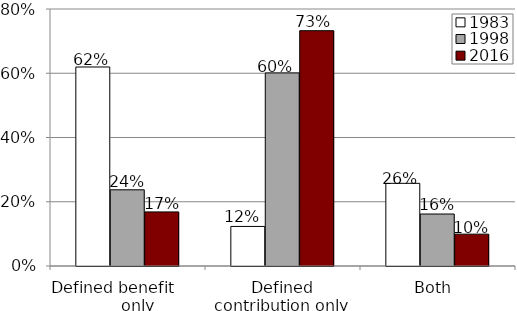
| Category | 1983 | 1998 | 2016 |
|---|---|---|---|
| Defined benefit           only | 0.619 | 0.237 | 0.168 |
| Defined contribution only | 0.123 | 0.601 | 0.732 |
| Both  | 0.257 | 0.162 | 0.099 |